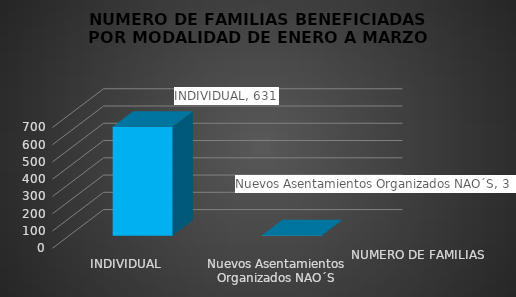
| Category | NUMERO DE FAMILIAS |
|---|---|
| INDIVIDUAL | 631 |
| Nuevos Asentamientos Organizados NAO´S | 3 |